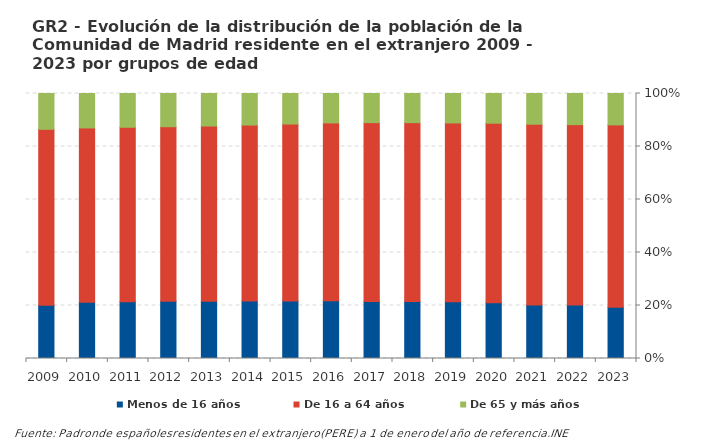
| Category | Menos de 16 años | De 16 a 64 años | De 65 y más años |
|---|---|---|---|
| 2023.0 | 91469 | 326253 | 56115 |
| 2022.0 | 91002 | 307016 | 53014 |
| 2021.0 | 86344 | 291209 | 49535 |
| 2020.0 | 88179 | 283620 | 46891 |
| 2019.0 | 85579 | 270098 | 44460 |
| 2018.0 | 82932 | 260137 | 42403 |
| 2017.0 | 79206 | 247837 | 40391 |
| 2016.0 | 75191 | 231117 | 38239 |
| 2015.0 | 69100 | 212181 | 36616 |
| 2014.0 | 63619 | 194438 | 34901 |
| 2013.0 | 57965 | 177348 | 32931 |
| 2012.0 | 53916 | 164680 | 31311 |
| 2011.0 | 49937 | 153254 | 29667 |
| 2010.0 | 45821 | 141638 | 27997 |
| 2009.0 | 39708 | 131154 | 26683 |